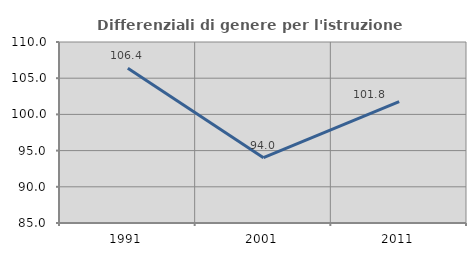
| Category | Differenziali di genere per l'istruzione superiore |
|---|---|
| 1991.0 | 106.364 |
| 2001.0 | 94.025 |
| 2011.0 | 101.75 |